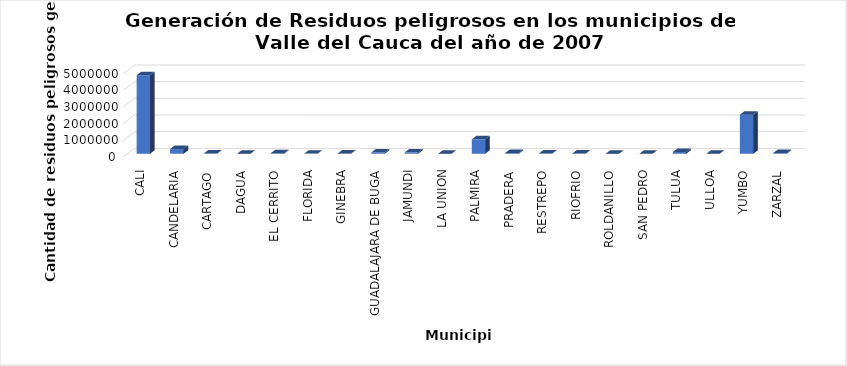
| Category | Total (kg) |
|---|---|
| CALI | 4712800 |
| CANDELARIA | 280648 |
| CARTAGO | 13816 |
| DAGUA | 3787.9 |
| EL CERRITO | 33448.4 |
| FLORIDA | 8010 |
| GINEBRA | 20177 |
| GUADALAJARA DE BUGA | 71593.7 |
| JAMUNDI | 82878 |
| LA UNION | 2650 |
| PALMIRA | 865872.46 |
| PRADERA | 49793 |
| RESTREPO | 12540 |
| RIOFRIO | 16741 |
| ROLDANILLO | 6369 |
| SAN PEDRO | 350 |
| TULUA | 106063.17 |
| ULLOA | 596 |
| YUMBO | 2342871.1 |
| ZARZAL | 48671 |